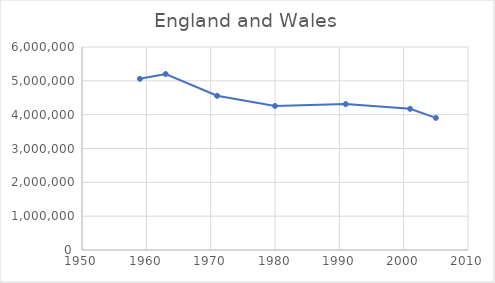
| Category | Catholic population |
|---|---|
| 1959.0 | 5058500 |
| 1963.0 | 5200200 |
| 1971.0 | 4557800 |
| 1980.0 | 4257400 |
| 1991.0 | 4312200 |
| 2001.0 | 4172700 |
| 2005.0 | 3904500 |